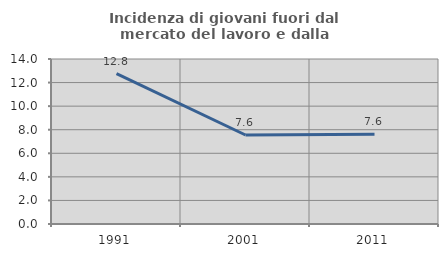
| Category | Incidenza di giovani fuori dal mercato del lavoro e dalla formazione  |
|---|---|
| 1991.0 | 12.759 |
| 2001.0 | 7.551 |
| 2011.0 | 7.617 |